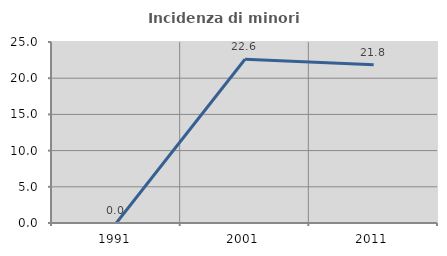
| Category | Incidenza di minori stranieri |
|---|---|
| 1991.0 | 0 |
| 2001.0 | 22.619 |
| 2011.0 | 21.849 |